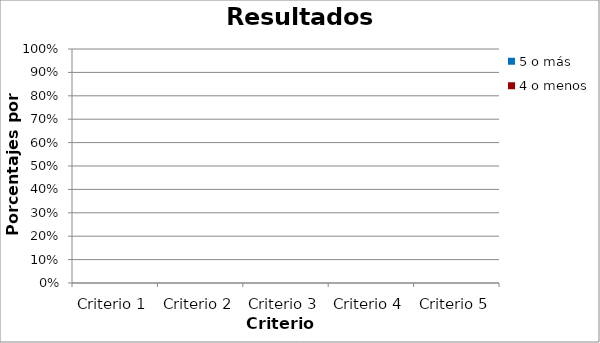
| Category | 5 o más | 4 o menos |
|---|---|---|
| Criterio 1 | 0 | 0 |
| Criterio 2 | 0 | 0 |
| Criterio 3 | 0 | 0 |
| Criterio 4 | 0 | 0 |
| Criterio 5 | 0 | 0 |